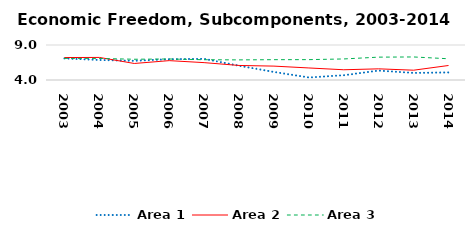
| Category | Area 1 | Area 2 | Area 3 |
|---|---|---|---|
| 2003.0 | 7.085 | 7.21 | 7.084 |
| 2004.0 | 6.859 | 7.224 | 7.081 |
| 2005.0 | 6.74 | 6.36 | 6.964 |
| 2006.0 | 6.972 | 6.766 | 7.003 |
| 2007.0 | 7.021 | 6.482 | 6.896 |
| 2008.0 | 6.04 | 6.077 | 6.874 |
| 2009.0 | 5.148 | 5.984 | 6.904 |
| 2010.0 | 4.36 | 5.721 | 6.909 |
| 2011.0 | 4.681 | 5.463 | 7.007 |
| 2012.0 | 5.344 | 5.594 | 7.266 |
| 2013.0 | 5.01 | 5.402 | 7.291 |
| 2014.0 | 5.08 | 6.072 | 7.033 |